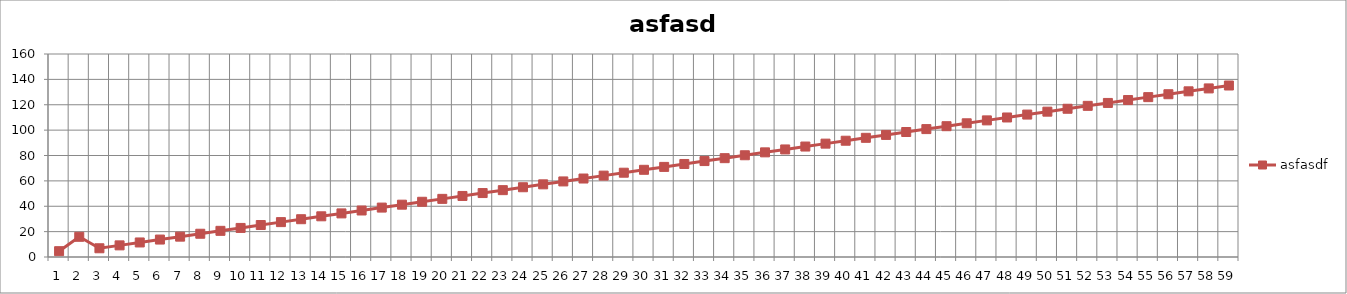
| Category | asfasdf |
|---|---|
| 0 | 4.582 |
| 1 | 15.915 |
| 2 | 6.873 |
| 3 | 9.164 |
| 4 | 11.461 |
| 5 | 13.746 |
| 6 | 16.037 |
| 7 | 18.328 |
| 8 | 20.619 |
| 9 | 22.91 |
| 10 | 25.201 |
| 11 | 27.492 |
| 12 | 29.783 |
| 13 | 32.074 |
| 14 | 34.365 |
| 15 | 36.656 |
| 16 | 38.948 |
| 17 | 41.239 |
| 18 | 43.53 |
| 19 | 45.821 |
| 20 | 48.112 |
| 21 | 50.403 |
| 22 | 52.694 |
| 23 | 54.985 |
| 24 | 57.276 |
| 25 | 59.567 |
| 26 | 61.858 |
| 27 | 64.149 |
| 28 | 66.44 |
| 29 | 68.731 |
| 30 | 71.022 |
| 31 | 73.313 |
| 32 | 75.604 |
| 33 | 77.895 |
| 34 | 80.186 |
| 35 | 82.477 |
| 36 | 84.768 |
| 37 | 87.059 |
| 38 | 89.35 |
| 39 | 91.641 |
| 40 | 93.932 |
| 41 | 96.223 |
| 42 | 98.514 |
| 43 | 100.805 |
| 44 | 103.096 |
| 45 | 105.387 |
| 46 | 107.678 |
| 47 | 109.969 |
| 48 | 112.261 |
| 49 | 114.552 |
| 50 | 116.843 |
| 51 | 119.134 |
| 52 | 121.425 |
| 53 | 123.716 |
| 54 | 126.007 |
| 55 | 128.298 |
| 56 | 130.589 |
| 57 | 132.88 |
| 58 | 135.171 |